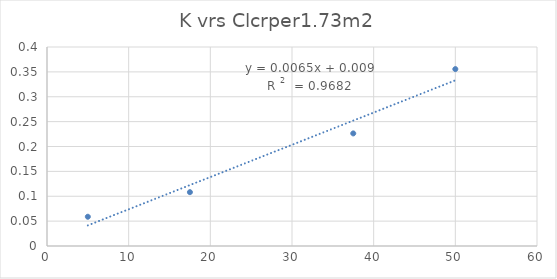
| Category | Series 0 |
|---|---|
| 50.0 | 0.356 |
| 37.5 | 0.226 |
| 17.5 | 0.108 |
| 5.0 | 0.059 |